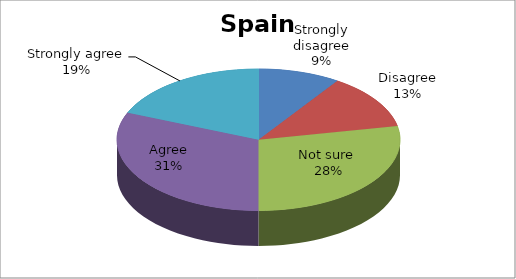
| Category | Spain |
|---|---|
| Strongly disagree | 3 |
| Disagree | 4 |
| Not sure  | 9 |
| Agree | 10 |
| Strongly agree | 6 |